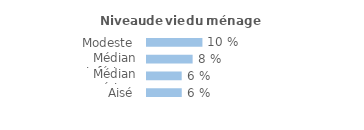
| Category | Series 0 |
|---|---|
| Modeste | 0.098 |
| Médian inférieur | 0.081 |
| Médian supérieur | 0.062 |
| Aisé | 0.062 |